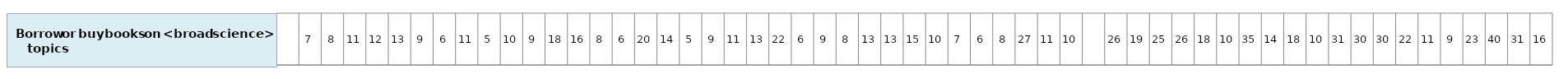
| Category | Borrow or buy books on <broad science> topics |
|---|---|
| nan | 1 |
| 7.363333189042537 | 1 |
| 8.088947417058208 | 1 |
| 10.75254890054584 | 1 |
| 12.08612501889015 | 1 |
| 13.45889081829895 | 1 |
| 8.865509929625029 | 1 |
| 6.245217666279983 | 1 |
| 11.49303142124475 | 1 |
| 4.622176865465582 | 1 |
| 10.33247782709527 | 1 |
| 8.930275334677837 | 1 |
| 17.5750812532428 | 1 |
| 15.86937546185382 | 1 |
| 8.115156076602652 | 1 |
| 6.312007505479064 | 1 |
| 19.84898001206165 | 1 |
| 13.89538933624444 | 1 |
| 5.449701231104669 | 1 |
| 9.047331989092251 | 1 |
| 11.21457406016226 | 1 |
| 13.00316150428948 | 1 |
| 22.31949565452914 | 1 |
| 6.224537685475641 | 1 |
| 9.4466794254817 | 1 |
| 8.259590496023247 | 1 |
| 12.83607506183861 | 1 |
| 13.15126846198377 | 1 |
| 15.03655563484414 | 1 |
| 9.848703356958167 | 1 |
| 7.407715764607303 | 1 |
| 6.077215978748353 | 1 |
| 8.377225784290248 | 1 |
| 26.77128663862231 | 1 |
| 10.89705174832846 | 1 |
| 10.06198228009541 | 1 |
| nan | 1 |
| 26.40647575448969 | 1 |
| 18.68216719990866 | 1 |
| 24.9646786507172 | 1 |
| 26.07922916729343 | 1 |
| 17.72142690075133 | 1 |
| 9.8587159313485 | 1 |
| 34.50417273486224 | 1 |
| 13.84101403428508 | 1 |
| 17.65117066472442 | 1 |
| 9.710218213995383 | 1 |
| 31.2021620087974 | 1 |
| 29.82261839449372 | 1 |
| 29.83443026348168 | 1 |
| 22.38789403240388 | 1 |
| 11.22355085034451 | 1 |
| 9.180186168900791 | 1 |
| 23.01095874856667 | 1 |
| 40.03457221033047 | 1 |
| 30.633626593949 | 1 |
| 15.93227182950232 | 1 |